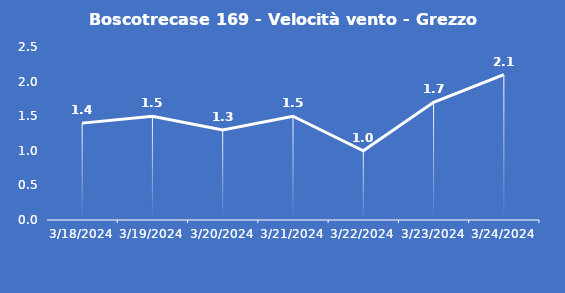
| Category | Boscotrecase 169 - Velocità vento - Grezzo (m/s) |
|---|---|
| 3/18/24 | 1.4 |
| 3/19/24 | 1.5 |
| 3/20/24 | 1.3 |
| 3/21/24 | 1.5 |
| 3/22/24 | 1 |
| 3/23/24 | 1.7 |
| 3/24/24 | 2.1 |